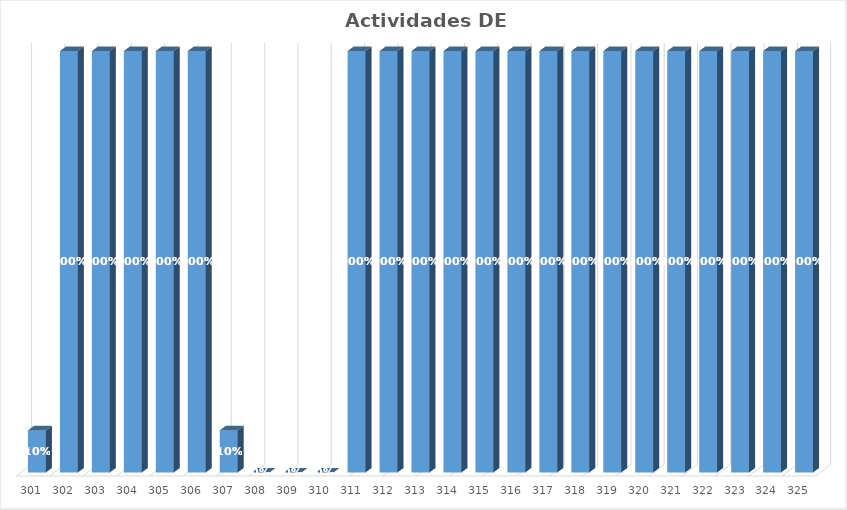
| Category | % Avance |
|---|---|
| 301.0 | 0.1 |
| 302.0 | 1 |
| 303.0 | 1 |
| 304.0 | 1 |
| 305.0 | 1 |
| 306.0 | 1 |
| 307.0 | 0.1 |
| 308.0 | 0 |
| 309.0 | 0 |
| 310.0 | 0 |
| 311.0 | 1 |
| 312.0 | 1 |
| 313.0 | 1 |
| 314.0 | 1 |
| 315.0 | 1 |
| 316.0 | 1 |
| 317.0 | 1 |
| 318.0 | 1 |
| 319.0 | 1 |
| 320.0 | 1 |
| 321.0 | 1 |
| 322.0 | 1 |
| 323.0 | 1 |
| 324.0 | 1 |
| 325.0 | 1 |